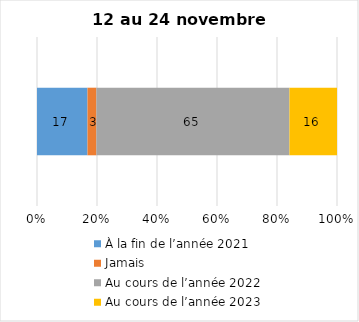
| Category | À la fin de l’année 2021 | Jamais | Au cours de l’année 2022 | Au cours de l’année 2023 |
|---|---|---|---|---|
| 0 | 17 | 3 | 65 | 16 |